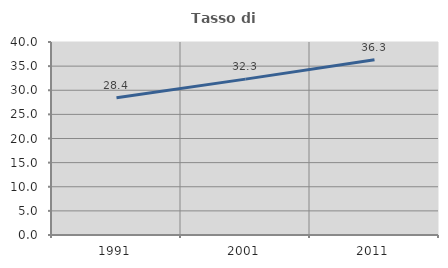
| Category | Tasso di occupazione   |
|---|---|
| 1991.0 | 28.433 |
| 2001.0 | 32.308 |
| 2011.0 | 36.329 |